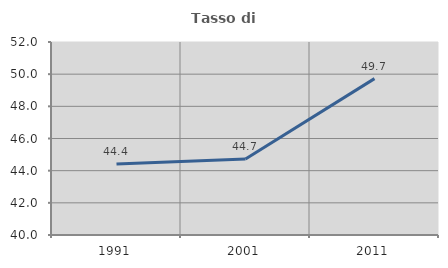
| Category | Tasso di occupazione   |
|---|---|
| 1991.0 | 44.417 |
| 2001.0 | 44.722 |
| 2011.0 | 49.724 |